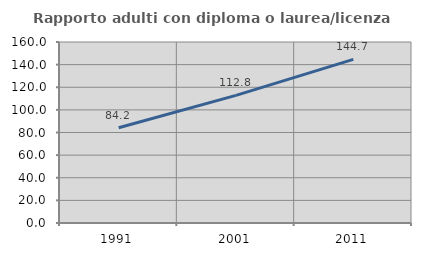
| Category | Rapporto adulti con diploma o laurea/licenza media  |
|---|---|
| 1991.0 | 84.249 |
| 2001.0 | 112.841 |
| 2011.0 | 144.683 |